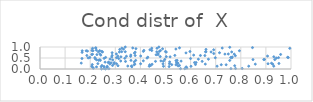
| Category | Series 0 |
|---|---|
| -100.0 | -100000 |
| -100.0 | -100000 |
| 0.19187879786047768 | 0.504 |
| -100.0 | -100000 |
| -100.0 | -100000 |
| -100.0 | -100000 |
| -100.0 | -100000 |
| -100.0 | -100000 |
| -100.0 | -100000 |
| -100.0 | -100000 |
| -100.0 | -100000 |
| -100.0 | -100000 |
| 0.4296224976861439 | 0.537 |
| -100.0 | -100000 |
| -100.0 | -100000 |
| -100.0 | -100000 |
| -100.0 | -100000 |
| -100.0 | -100000 |
| -100.0 | -100000 |
| -100.0 | -100000 |
| -100.0 | -100000 |
| -100.0 | -100000 |
| -100.0 | -100000 |
| -100.0 | -100000 |
| 0.2251686918316177 | 0.418 |
| -100.0 | -100000 |
| -100.0 | -100000 |
| -100.0 | -100000 |
| -100.0 | -100000 |
| -100.0 | -100000 |
| -100.0 | -100000 |
| -100.0 | -100000 |
| -100.0 | -100000 |
| -100.0 | -100000 |
| -100.0 | -100000 |
| -100.0 | -100000 |
| -100.0 | -100000 |
| -100.0 | -100000 |
| 0.20939885757398724 | 0.94 |
| -100.0 | -100000 |
| 0.5816440431107636 | 0.731 |
| -100.0 | -100000 |
| -100.0 | -100000 |
| -100.0 | -100000 |
| -100.0 | -100000 |
| -100.0 | -100000 |
| -100.0 | -100000 |
| -100.0 | -100000 |
| -100.0 | -100000 |
| -100.0 | -100000 |
| -100.0 | -100000 |
| -100.0 | -100000 |
| -100.0 | -100000 |
| -100.0 | -100000 |
| -100.0 | -100000 |
| -100.0 | -100000 |
| -100.0 | -100000 |
| -100.0 | -100000 |
| 0.7637295574614567 | 0.775 |
| 0.3050601643916153 | 0.512 |
| -100.0 | -100000 |
| 0.2553474817145608 | 0.482 |
| -100.0 | -100000 |
| -100.0 | -100000 |
| 0.49203139905379956 | 0.122 |
| 0.2667020137794205 | 0.087 |
| 0.9065603821030419 | 0.587 |
| 0.18915653105718144 | 0.813 |
| -100.0 | -100000 |
| -100.0 | -100000 |
| -100.0 | -100000 |
| -100.0 | -100000 |
| -100.0 | -100000 |
| -100.0 | -100000 |
| -100.0 | -100000 |
| -100.0 | -100000 |
| -100.0 | -100000 |
| -100.0 | -100000 |
| -100.0 | -100000 |
| 0.7639932975936461 | 0.51 |
| -100.0 | -100000 |
| -100.0 | -100000 |
| -100.0 | -100000 |
| -100.0 | -100000 |
| -100.0 | -100000 |
| -100.0 | -100000 |
| -100.0 | -100000 |
| -100.0 | -100000 |
| -100.0 | -100000 |
| -100.0 | -100000 |
| -100.0 | -100000 |
| -100.0 | -100000 |
| -100.0 | -100000 |
| -100.0 | -100000 |
| -100.0 | -100000 |
| 0.3822589108104296 | 0.925 |
| -100.0 | -100000 |
| -100.0 | -100000 |
| -100.0 | -100000 |
| -100.0 | -100000 |
| -100.0 | -100000 |
| -100.0 | -100000 |
| -100.0 | -100000 |
| -100.0 | -100000 |
| -100.0 | -100000 |
| -100.0 | -100000 |
| -100.0 | -100000 |
| -100.0 | -100000 |
| -100.0 | -100000 |
| -100.0 | -100000 |
| 0.5496870743826148 | 0.266 |
| -100.0 | -100000 |
| -100.0 | -100000 |
| -100.0 | -100000 |
| -100.0 | -100000 |
| -100.0 | -100000 |
| 0.9418769743370389 | 0.497 |
| 0.3256701429219151 | 0.788 |
| 0.7740199675463291 | 0.675 |
| -100.0 | -100000 |
| 0.16433612483010096 | 0.268 |
| -100.0 | -100000 |
| 0.681617395554677 | 0.774 |
| -100.0 | -100000 |
| -100.0 | -100000 |
| -100.0 | -100000 |
| -100.0 | -100000 |
| 0.5502491938861755 | 0.14 |
| -100.0 | -100000 |
| -100.0 | -100000 |
| -100.0 | -100000 |
| 0.3327204524582331 | 0.906 |
| -100.0 | -100000 |
| -100.0 | -100000 |
| -100.0 | -100000 |
| -100.0 | -100000 |
| -100.0 | -100000 |
| -100.0 | -100000 |
| -100.0 | -100000 |
| -100.0 | -100000 |
| -100.0 | -100000 |
| -100.0 | -100000 |
| -100.0 | -100000 |
| -100.0 | -100000 |
| -100.0 | -100000 |
| -100.0 | -100000 |
| -100.0 | -100000 |
| -100.0 | -100000 |
| 0.282922323134851 | 0.283 |
| -100.0 | -100000 |
| 0.6611241601250445 | 0.781 |
| -100.0 | -100000 |
| -100.0 | -100000 |
| 0.25502019649960594 | 0.024 |
| -100.0 | -100000 |
| 0.34988766715490793 | 0.134 |
| -100.0 | -100000 |
| -100.0 | -100000 |
| -100.0 | -100000 |
| 0.4466318419540014 | 0.216 |
| -100.0 | -100000 |
| -100.0 | -100000 |
| -100.0 | -100000 |
| -100.0 | -100000 |
| 0.4704986228340291 | 0.699 |
| -100.0 | -100000 |
| -100.0 | -100000 |
| -100.0 | -100000 |
| -100.0 | -100000 |
| -100.0 | -100000 |
| -100.0 | -100000 |
| -100.0 | -100000 |
| -100.0 | -100000 |
| -100.0 | -100000 |
| -100.0 | -100000 |
| 0.6155970152128075 | 0.292 |
| -100.0 | -100000 |
| -100.0 | -100000 |
| -100.0 | -100000 |
| -100.0 | -100000 |
| -100.0 | -100000 |
| 0.21974380534102522 | 0.465 |
| -100.0 | -100000 |
| -100.0 | -100000 |
| -100.0 | -100000 |
| -100.0 | -100000 |
| -100.0 | -100000 |
| -100.0 | -100000 |
| -100.0 | -100000 |
| -100.0 | -100000 |
| -100.0 | -100000 |
| -100.0 | -100000 |
| -100.0 | -100000 |
| -100.0 | -100000 |
| -100.0 | -100000 |
| 0.37521510980602013 | 0.196 |
| -100.0 | -100000 |
| -100.0 | -100000 |
| -100.0 | -100000 |
| 0.3624422175529668 | 0.391 |
| -100.0 | -100000 |
| -100.0 | -100000 |
| -100.0 | -100000 |
| 0.44523287967693836 | 0.842 |
| 0.4789717255678654 | 0.566 |
| -100.0 | -100000 |
| -100.0 | -100000 |
| -100.0 | -100000 |
| -100.0 | -100000 |
| -100.0 | -100000 |
| -100.0 | -100000 |
| -100.0 | -100000 |
| -100.0 | -100000 |
| 0.4351982912702477 | 0.125 |
| 0.7599091323669214 | 0.526 |
| -100.0 | -100000 |
| 0.278606509897224 | 0.226 |
| -100.0 | -100000 |
| -100.0 | -100000 |
| -100.0 | -100000 |
| 0.5852058785735164 | 0.042 |
| 0.2613730196282348 | 0.527 |
| -100.0 | -100000 |
| -100.0 | -100000 |
| -100.0 | -100000 |
| -100.0 | -100000 |
| 0.8315266321342155 | 0.129 |
| -100.0 | -100000 |
| -100.0 | -100000 |
| -100.0 | -100000 |
| 0.6596618350748987 | 0.783 |
| -100.0 | -100000 |
| -100.0 | -100000 |
| -100.0 | -100000 |
| -100.0 | -100000 |
| -100.0 | -100000 |
| -100.0 | -100000 |
| -100.0 | -100000 |
| 0.7503182706500822 | 0.682 |
| -100.0 | -100000 |
| -100.0 | -100000 |
| -100.0 | -100000 |
| -100.0 | -100000 |
| -100.0 | -100000 |
| -100.0 | -100000 |
| -100.0 | -100000 |
| -100.0 | -100000 |
| -100.0 | -100000 |
| -100.0 | -100000 |
| -100.0 | -100000 |
| -100.0 | -100000 |
| -100.0 | -100000 |
| -100.0 | -100000 |
| -100.0 | -100000 |
| -100.0 | -100000 |
| -100.0 | -100000 |
| -100.0 | -100000 |
| -100.0 | -100000 |
| -100.0 | -100000 |
| -100.0 | -100000 |
| -100.0 | -100000 |
| -100.0 | -100000 |
| -100.0 | -100000 |
| -100.0 | -100000 |
| -100.0 | -100000 |
| -100.0 | -100000 |
| -100.0 | -100000 |
| -100.0 | -100000 |
| -100.0 | -100000 |
| -100.0 | -100000 |
| -100.0 | -100000 |
| -100.0 | -100000 |
| -100.0 | -100000 |
| 0.33795944759262986 | 0.487 |
| -100.0 | -100000 |
| -100.0 | -100000 |
| -100.0 | -100000 |
| -100.0 | -100000 |
| -100.0 | -100000 |
| -100.0 | -100000 |
| -100.0 | -100000 |
| 0.23914817014861622 | 0.683 |
| -100.0 | -100000 |
| -100.0 | -100000 |
| -100.0 | -100000 |
| -100.0 | -100000 |
| -100.0 | -100000 |
| 0.24680507783390082 | 0.158 |
| -100.0 | -100000 |
| 0.23783188197156513 | 0.833 |
| -100.0 | -100000 |
| -100.0 | -100000 |
| -100.0 | -100000 |
| -100.0 | -100000 |
| -100.0 | -100000 |
| -100.0 | -100000 |
| 0.34424693027069375 | 0.58 |
| -100.0 | -100000 |
| -100.0 | -100000 |
| -100.0 | -100000 |
| -100.0 | -100000 |
| -100.0 | -100000 |
| -100.0 | -100000 |
| -100.0 | -100000 |
| -100.0 | -100000 |
| -100.0 | -100000 |
| -100.0 | -100000 |
| 0.6391309777898468 | 0.615 |
| -100.0 | -100000 |
| 0.16731013530644934 | 0.477 |
| -100.0 | -100000 |
| -100.0 | -100000 |
| -100.0 | -100000 |
| 0.20828665464862384 | 0.201 |
| -100.0 | -100000 |
| -100.0 | -100000 |
| -100.0 | -100000 |
| 0.38118780702664146 | 0.391 |
| -100.0 | -100000 |
| -100.0 | -100000 |
| -100.0 | -100000 |
| -100.0 | -100000 |
| -100.0 | -100000 |
| 0.5032850026031422 | 0.56 |
| 0.6016906126865291 | 0.123 |
| -100.0 | -100000 |
| -100.0 | -100000 |
| 0.23047496795832656 | 0.244 |
| -100.0 | -100000 |
| -100.0 | -100000 |
| -100.0 | -100000 |
| -100.0 | -100000 |
| -100.0 | -100000 |
| -100.0 | -100000 |
| -100.0 | -100000 |
| -100.0 | -100000 |
| 0.37913019498877587 | 0.765 |
| -100.0 | -100000 |
| -100.0 | -100000 |
| -100.0 | -100000 |
| -100.0 | -100000 |
| -100.0 | -100000 |
| -100.0 | -100000 |
| -100.0 | -100000 |
| -100.0 | -100000 |
| -100.0 | -100000 |
| -100.0 | -100000 |
| -100.0 | -100000 |
| -100.0 | -100000 |
| 0.9587002853319889 | 0.661 |
| -100.0 | -100000 |
| 0.30500730674287335 | 0.239 |
| 0.3163226875464985 | 0.772 |
| -100.0 | -100000 |
| -100.0 | -100000 |
| -100.0 | -100000 |
| -100.0 | -100000 |
| -100.0 | -100000 |
| -100.0 | -100000 |
| -100.0 | -100000 |
| -100.0 | -100000 |
| 0.7559870351411391 | 0.389 |
| -100.0 | -100000 |
| -100.0 | -100000 |
| -100.0 | -100000 |
| -100.0 | -100000 |
| -100.0 | -100000 |
| -100.0 | -100000 |
| 0.16779261318989291 | 0.754 |
| -100.0 | -100000 |
| -100.0 | -100000 |
| -100.0 | -100000 |
| -100.0 | -100000 |
| -100.0 | -100000 |
| 0.376183444377469 | 0.72 |
| -100.0 | -100000 |
| -100.0 | -100000 |
| -100.0 | -100000 |
| -100.0 | -100000 |
| -100.0 | -100000 |
| -100.0 | -100000 |
| -100.0 | -100000 |
| -100.0 | -100000 |
| -100.0 | -100000 |
| -100.0 | -100000 |
| 0.6920109922518849 | 0.874 |
| 0.30435218441106715 | 0.684 |
| -100.0 | -100000 |
| -100.0 | -100000 |
| -100.0 | -100000 |
| 0.7943881429237363 | 0.83 |
| -100.0 | -100000 |
| -100.0 | -100000 |
| -100.0 | -100000 |
| -100.0 | -100000 |
| -100.0 | -100000 |
| -100.0 | -100000 |
| -100.0 | -100000 |
| -100.0 | -100000 |
| -100.0 | -100000 |
| -100.0 | -100000 |
| -100.0 | -100000 |
| -100.0 | -100000 |
| -100.0 | -100000 |
| -100.0 | -100000 |
| -100.0 | -100000 |
| 0.20650176269031983 | 0.657 |
| -100.0 | -100000 |
| -100.0 | -100000 |
| -100.0 | -100000 |
| 0.894416459786068 | 0.434 |
| -100.0 | -100000 |
| -100.0 | -100000 |
| 0.5158422454907788 | 0.239 |
| -100.0 | -100000 |
| -100.0 | -100000 |
| -100.0 | -100000 |
| -100.0 | -100000 |
| 0.4263880408014544 | 0.496 |
| -100.0 | -100000 |
| -100.0 | -100000 |
| -100.0 | -100000 |
| -100.0 | -100000 |
| 0.22471361010595137 | 0.853 |
| 0.3175891911530946 | 0.889 |
| -100.0 | -100000 |
| -100.0 | -100000 |
| -100.0 | -100000 |
| -100.0 | -100000 |
| -100.0 | -100000 |
| -100.0 | -100000 |
| -100.0 | -100000 |
| -100.0 | -100000 |
| -100.0 | -100000 |
| -100.0 | -100000 |
| -100.0 | -100000 |
| -100.0 | -100000 |
| -100.0 | -100000 |
| -100.0 | -100000 |
| -100.0 | -100000 |
| -100.0 | -100000 |
| -100.0 | -100000 |
| -100.0 | -100000 |
| 0.4370916397126354 | 0.192 |
| 0.9224302886151942 | 0.262 |
| -100.0 | -100000 |
| -100.0 | -100000 |
| -100.0 | -100000 |
| -100.0 | -100000 |
| -100.0 | -100000 |
| -100.0 | -100000 |
| -100.0 | -100000 |
| -100.0 | -100000 |
| -100.0 | -100000 |
| -100.0 | -100000 |
| -100.0 | -100000 |
| -100.0 | -100000 |
| -100.0 | -100000 |
| 0.37546543730731485 | 0.326 |
| -100.0 | -100000 |
| 0.2187454687769319 | 0.519 |
| -100.0 | -100000 |
| -100.0 | -100000 |
| -100.0 | -100000 |
| -100.0 | -100000 |
| 0.27189752846479587 | 0.291 |
| -100.0 | -100000 |
| -100.0 | -100000 |
| -100.0 | -100000 |
| -100.0 | -100000 |
| -100.0 | -100000 |
| -100.0 | -100000 |
| -100.0 | -100000 |
| -100.0 | -100000 |
| -100.0 | -100000 |
| 0.43771643095411816 | 0.872 |
| -100.0 | -100000 |
| -100.0 | -100000 |
| 0.2228108382298407 | 0.954 |
| 0.7790921357145734 | 0.021 |
| -100.0 | -100000 |
| -100.0 | -100000 |
| -100.0 | -100000 |
| -100.0 | -100000 |
| -100.0 | -100000 |
| -100.0 | -100000 |
| -100.0 | -100000 |
| -100.0 | -100000 |
| -100.0 | -100000 |
| 0.6568691607360193 | 0.611 |
| -100.0 | -100000 |
| -100.0 | -100000 |
| -100.0 | -100000 |
| -100.0 | -100000 |
| -100.0 | -100000 |
| -100.0 | -100000 |
| -100.0 | -100000 |
| -100.0 | -100000 |
| -100.0 | -100000 |
| -100.0 | -100000 |
| -100.0 | -100000 |
| -100.0 | -100000 |
| -100.0 | -100000 |
| -100.0 | -100000 |
| -100.0 | -100000 |
| -100.0 | -100000 |
| 0.23341933274696025 | 0.395 |
| -100.0 | -100000 |
| -100.0 | -100000 |
| -100.0 | -100000 |
| -100.0 | -100000 |
| -100.0 | -100000 |
| -100.0 | -100000 |
| -100.0 | -100000 |
| 0.22512395210268232 | 0.095 |
| -100.0 | -100000 |
| -100.0 | -100000 |
| -100.0 | -100000 |
| -100.0 | -100000 |
| -100.0 | -100000 |
| 0.31070677299256033 | 0.149 |
| -100.0 | -100000 |
| -100.0 | -100000 |
| -100.0 | -100000 |
| -100.0 | -100000 |
| -100.0 | -100000 |
| -100.0 | -100000 |
| -100.0 | -100000 |
| -100.0 | -100000 |
| -100.0 | -100000 |
| -100.0 | -100000 |
| -100.0 | -100000 |
| -100.0 | -100000 |
| -100.0 | -100000 |
| 0.8055011477738415 | 0.023 |
| -100.0 | -100000 |
| -100.0 | -100000 |
| -100.0 | -100000 |
| -100.0 | -100000 |
| -100.0 | -100000 |
| -100.0 | -100000 |
| 0.582386269931465 | 0.096 |
| -100.0 | -100000 |
| -100.0 | -100000 |
| -100.0 | -100000 |
| -100.0 | -100000 |
| -100.0 | -100000 |
| -100.0 | -100000 |
| 0.9353104379878 | 0.426 |
| -100.0 | -100000 |
| -100.0 | -100000 |
| -100.0 | -100000 |
| -100.0 | -100000 |
| -100.0 | -100000 |
| 0.555597384610156 | 0.162 |
| -100.0 | -100000 |
| -100.0 | -100000 |
| -100.0 | -100000 |
| -100.0 | -100000 |
| 0.20932897513727833 | 0.669 |
| -100.0 | -100000 |
| 0.2451965008652771 | 0.003 |
| -100.0 | -100000 |
| -100.0 | -100000 |
| -100.0 | -100000 |
| -100.0 | -100000 |
| -100.0 | -100000 |
| 0.3618406845669442 | 0.634 |
| -100.0 | -100000 |
| 0.27352491304284776 | 0.312 |
| -100.0 | -100000 |
| -100.0 | -100000 |
| 0.698445414171746 | 0.511 |
| 0.8915782337760583 | 0.428 |
| 0.3215353931150503 | 0.363 |
| -100.0 | -100000 |
| 0.5165515494945132 | 0.324 |
| -100.0 | -100000 |
| -100.0 | -100000 |
| -100.0 | -100000 |
| -100.0 | -100000 |
| -100.0 | -100000 |
| 0.736762711610288 | 0.677 |
| -100.0 | -100000 |
| -100.0 | -100000 |
| 0.5462561134884889 | 0.393 |
| 0.37790903698737244 | 0.222 |
| -100.0 | -100000 |
| 0.23821711912621968 | 0.421 |
| 0.3102538954576177 | 0.587 |
| -100.0 | -100000 |
| -100.0 | -100000 |
| -100.0 | -100000 |
| -100.0 | -100000 |
| -100.0 | -100000 |
| 0.9502939386492661 | 0.517 |
| -100.0 | -100000 |
| -100.0 | -100000 |
| -100.0 | -100000 |
| -100.0 | -100000 |
| -100.0 | -100000 |
| -100.0 | -100000 |
| -100.0 | -100000 |
| -100.0 | -100000 |
| -100.0 | -100000 |
| 0.2873610719695805 | 0.74 |
| -100.0 | -100000 |
| 0.6710027540885751 | 0.446 |
| -100.0 | -100000 |
| -100.0 | -100000 |
| -100.0 | -100000 |
| -100.0 | -100000 |
| -100.0 | -100000 |
| -100.0 | -100000 |
| -100.0 | -100000 |
| 0.1866818977305128 | 0.614 |
| -100.0 | -100000 |
| -100.0 | -100000 |
| -100.0 | -100000 |
| 0.4662170571116231 | 0.942 |
| -100.0 | -100000 |
| -100.0 | -100000 |
| -100.0 | -100000 |
| -100.0 | -100000 |
| -100.0 | -100000 |
| -100.0 | -100000 |
| -100.0 | -100000 |
| -100.0 | -100000 |
| -100.0 | -100000 |
| 0.3610351131361368 | 0.575 |
| 0.541670181146668 | 0.38 |
| -100.0 | -100000 |
| -100.0 | -100000 |
| -100.0 | -100000 |
| -100.0 | -100000 |
| 0.7606733434378987 | 0.015 |
| -100.0 | -100000 |
| -100.0 | -100000 |
| -100.0 | -100000 |
| -100.0 | -100000 |
| -100.0 | -100000 |
| -100.0 | -100000 |
| -100.0 | -100000 |
| -100.0 | -100000 |
| -100.0 | -100000 |
| -100.0 | -100000 |
| -100.0 | -100000 |
| -100.0 | -100000 |
| 0.5599872243091598 | 0.015 |
| -100.0 | -100000 |
| -100.0 | -100000 |
| -100.0 | -100000 |
| -100.0 | -100000 |
| -100.0 | -100000 |
| 0.49159442339425374 | 0.35 |
| -100.0 | -100000 |
| 0.9314279714402884 | 0.128 |
| -100.0 | -100000 |
| -100.0 | -100000 |
| -100.0 | -100000 |
| -100.0 | -100000 |
| -100.0 | -100000 |
| -100.0 | -100000 |
| -100.0 | -100000 |
| -100.0 | -100000 |
| -100.0 | -100000 |
| -100.0 | -100000 |
| -100.0 | -100000 |
| -100.0 | -100000 |
| 0.9951383937138106 | 0.939 |
| -100.0 | -100000 |
| 0.21023838530924832 | 0.067 |
| -100.0 | -100000 |
| -100.0 | -100000 |
| 0.24899661968324804 | 0.774 |
| -100.0 | -100000 |
| -100.0 | -100000 |
| -100.0 | -100000 |
| -100.0 | -100000 |
| 0.9315422521077081 | 0.556 |
| -100.0 | -100000 |
| -100.0 | -100000 |
| -100.0 | -100000 |
| -100.0 | -100000 |
| 0.5452791084124988 | 0.294 |
| -100.0 | -100000 |
| -100.0 | -100000 |
| 0.23275767309322692 | 0.78 |
| -100.0 | -100000 |
| -100.0 | -100000 |
| 0.988968515245191 | 0.521 |
| -100.0 | -100000 |
| -100.0 | -100000 |
| 0.597468689486578 | 0.796 |
| -100.0 | -100000 |
| -100.0 | -100000 |
| -100.0 | -100000 |
| -100.0 | -100000 |
| -100.0 | -100000 |
| -100.0 | -100000 |
| -100.0 | -100000 |
| 0.2746716950019883 | 0.011 |
| -100.0 | -100000 |
| 0.20612441613082955 | 0.129 |
| -100.0 | -100000 |
| -100.0 | -100000 |
| 0.5999396826141097 | 0.475 |
| -100.0 | -100000 |
| -100.0 | -100000 |
| -100.0 | -100000 |
| -100.0 | -100000 |
| -100.0 | -100000 |
| 0.21258200194332366 | 0.033 |
| -100.0 | -100000 |
| -100.0 | -100000 |
| -100.0 | -100000 |
| -100.0 | -100000 |
| -100.0 | -100000 |
| -100.0 | -100000 |
| -100.0 | -100000 |
| -100.0 | -100000 |
| -100.0 | -100000 |
| -100.0 | -100000 |
| 0.44105098137775434 | 0.16 |
| -100.0 | -100000 |
| -100.0 | -100000 |
| 0.21110580276425195 | 0.83 |
| -100.0 | -100000 |
| -100.0 | -100000 |
| 0.4116622878513345 | 0.371 |
| -100.0 | -100000 |
| 0.3407192627931094 | 0.345 |
| -100.0 | -100000 |
| -100.0 | -100000 |
| 0.41385437623360777 | 0.844 |
| -100.0 | -100000 |
| 0.4817336766026966 | 0.368 |
| -100.0 | -100000 |
| 0.5248868619039916 | 0.197 |
| 0.6586281720351973 | 0.222 |
| -100.0 | -100000 |
| 0.3223727914639689 | 0.554 |
| -100.0 | -100000 |
| 0.2593472433746231 | 0.312 |
| -100.0 | -100000 |
| -100.0 | -100000 |
| -100.0 | -100000 |
| -100.0 | -100000 |
| -100.0 | -100000 |
| -100.0 | -100000 |
| -100.0 | -100000 |
| -100.0 | -100000 |
| 0.37920057562293696 | 0.613 |
| -100.0 | -100000 |
| -100.0 | -100000 |
| -100.0 | -100000 |
| -100.0 | -100000 |
| -100.0 | -100000 |
| -100.0 | -100000 |
| 0.4996907973285465 | 0.793 |
| -100.0 | -100000 |
| -100.0 | -100000 |
| 0.4653388486033244 | 0.78 |
| -100.0 | -100000 |
| -100.0 | -100000 |
| -100.0 | -100000 |
| -100.0 | -100000 |
| -100.0 | -100000 |
| -100.0 | -100000 |
| 0.5621662886144818 | 0.358 |
| -100.0 | -100000 |
| 0.6613810115313914 | 0.891 |
| -100.0 | -100000 |
| -100.0 | -100000 |
| 0.3694266199553855 | 0.957 |
| 0.4884188600730133 | 0.918 |
| -100.0 | -100000 |
| 0.6193978670536209 | 0.203 |
| -100.0 | -100000 |
| -100.0 | -100000 |
| 0.5557759700371547 | 0.962 |
| 0.1983826988384887 | 0.524 |
| -100.0 | -100000 |
| -100.0 | -100000 |
| -100.0 | -100000 |
| -100.0 | -100000 |
| -100.0 | -100000 |
| -100.0 | -100000 |
| -100.0 | -100000 |
| -100.0 | -100000 |
| -100.0 | -100000 |
| -100.0 | -100000 |
| -100.0 | -100000 |
| 0.7222283674976765 | 0.194 |
| -100.0 | -100000 |
| 0.47975809419131754 | 0.836 |
| -100.0 | -100000 |
| -100.0 | -100000 |
| -100.0 | -100000 |
| -100.0 | -100000 |
| -100.0 | -100000 |
| -100.0 | -100000 |
| -100.0 | -100000 |
| -100.0 | -100000 |
| -100.0 | -100000 |
| -100.0 | -100000 |
| -100.0 | -100000 |
| 0.2891202515745286 | 0.16 |
| -100.0 | -100000 |
| -100.0 | -100000 |
| -100.0 | -100000 |
| -100.0 | -100000 |
| -100.0 | -100000 |
| -100.0 | -100000 |
| -100.0 | -100000 |
| -100.0 | -100000 |
| -100.0 | -100000 |
| -100.0 | -100000 |
| -100.0 | -100000 |
| -100.0 | -100000 |
| -100.0 | -100000 |
| -100.0 | -100000 |
| -100.0 | -100000 |
| -100.0 | -100000 |
| 0.8485638244472773 | 0.428 |
| -100.0 | -100000 |
| -100.0 | -100000 |
| -100.0 | -100000 |
| -100.0 | -100000 |
| -100.0 | -100000 |
| -100.0 | -100000 |
| -100.0 | -100000 |
| -100.0 | -100000 |
| -100.0 | -100000 |
| -100.0 | -100000 |
| -100.0 | -100000 |
| -100.0 | -100000 |
| 0.3658313003531096 | 0.102 |
| -100.0 | -100000 |
| -100.0 | -100000 |
| -100.0 | -100000 |
| -100.0 | -100000 |
| -100.0 | -100000 |
| -100.0 | -100000 |
| -100.0 | -100000 |
| -100.0 | -100000 |
| -100.0 | -100000 |
| -100.0 | -100000 |
| -100.0 | -100000 |
| 0.2790518279686339 | 0.449 |
| -100.0 | -100000 |
| 0.7152152422028835 | 0.739 |
| -100.0 | -100000 |
| -100.0 | -100000 |
| -100.0 | -100000 |
| -100.0 | -100000 |
| -100.0 | -100000 |
| -100.0 | -100000 |
| -100.0 | -100000 |
| -100.0 | -100000 |
| -100.0 | -100000 |
| 0.3397003891745447 | 0.999 |
| -100.0 | -100000 |
| -100.0 | -100000 |
| -100.0 | -100000 |
| -100.0 | -100000 |
| -100.0 | -100000 |
| -100.0 | -100000 |
| 0.2895513735991486 | 0.413 |
| -100.0 | -100000 |
| 0.8465553823371011 | 0.972 |
| -100.0 | -100000 |
| -100.0 | -100000 |
| -100.0 | -100000 |
| -100.0 | -100000 |
| -100.0 | -100000 |
| -100.0 | -100000 |
| -100.0 | -100000 |
| -100.0 | -100000 |
| -100.0 | -100000 |
| 0.24045085899455299 | 0.391 |
| -100.0 | -100000 |
| -100.0 | -100000 |
| -100.0 | -100000 |
| -100.0 | -100000 |
| 0.5413917241796974 | 0.907 |
| -100.0 | -100000 |
| -100.0 | -100000 |
| -100.0 | -100000 |
| -100.0 | -100000 |
| -100.0 | -100000 |
| -100.0 | -100000 |
| -100.0 | -100000 |
| -100.0 | -100000 |
| -100.0 | -100000 |
| -100.0 | -100000 |
| -100.0 | -100000 |
| -100.0 | -100000 |
| 0.401118358799745 | 0.591 |
| -100.0 | -100000 |
| -100.0 | -100000 |
| -100.0 | -100000 |
| -100.0 | -100000 |
| -100.0 | -100000 |
| 0.28581587674909426 | 0.548 |
| -100.0 | -100000 |
| 0.3259898915490892 | 0.947 |
| -100.0 | -100000 |
| -100.0 | -100000 |
| -100.0 | -100000 |
| -100.0 | -100000 |
| -100.0 | -100000 |
| -100.0 | -100000 |
| -100.0 | -100000 |
| -100.0 | -100000 |
| -100.0 | -100000 |
| 0.24212587864365143 | 0.63 |
| -100.0 | -100000 |
| -100.0 | -100000 |
| -100.0 | -100000 |
| -100.0 | -100000 |
| -100.0 | -100000 |
| -100.0 | -100000 |
| -100.0 | -100000 |
| 0.5768191920200989 | 0.016 |
| -100.0 | -100000 |
| -100.0 | -100000 |
| -100.0 | -100000 |
| -100.0 | -100000 |
| 0.22178904538462862 | 0.958 |
| -100.0 | -100000 |
| -100.0 | -100000 |
| -100.0 | -100000 |
| -100.0 | -100000 |
| -100.0 | -100000 |
| -100.0 | -100000 |
| -100.0 | -100000 |
| -100.0 | -100000 |
| -100.0 | -100000 |
| -100.0 | -100000 |
| -100.0 | -100000 |
| -100.0 | -100000 |
| -100.0 | -100000 |
| -100.0 | -100000 |
| -100.0 | -100000 |
| -100.0 | -100000 |
| -100.0 | -100000 |
| -100.0 | -100000 |
| -100.0 | -100000 |
| 0.6219227901636352 | 0.295 |
| -100.0 | -100000 |
| -100.0 | -100000 |
| -100.0 | -100000 |
| -100.0 | -100000 |
| -100.0 | -100000 |
| -100.0 | -100000 |
| -100.0 | -100000 |
| -100.0 | -100000 |
| -100.0 | -100000 |
| -100.0 | -100000 |
| -100.0 | -100000 |
| -100.0 | -100000 |
| -100.0 | -100000 |
| -100.0 | -100000 |
| -100.0 | -100000 |
| -100.0 | -100000 |
| -100.0 | -100000 |
| -100.0 | -100000 |
| -100.0 | -100000 |
| -100.0 | -100000 |
| -100.0 | -100000 |
| -100.0 | -100000 |
| -100.0 | -100000 |
| 0.5372513183213166 | 0.618 |
| -100.0 | -100000 |
| -100.0 | -100000 |
| -100.0 | -100000 |
| -100.0 | -100000 |
| -100.0 | -100000 |
| -100.0 | -100000 |
| -100.0 | -100000 |
| -100.0 | -100000 |
| -100.0 | -100000 |
| -100.0 | -100000 |
| -100.0 | -100000 |
| -100.0 | -100000 |
| -100.0 | -100000 |
| -100.0 | -100000 |
| -100.0 | -100000 |
| -100.0 | -100000 |
| -100.0 | -100000 |
| -100.0 | -100000 |
| -100.0 | -100000 |
| -100.0 | -100000 |
| -100.0 | -100000 |
| -100.0 | -100000 |
| 0.544466317788866 | 0.282 |
| -100.0 | -100000 |
| -100.0 | -100000 |
| -100.0 | -100000 |
| -100.0 | -100000 |
| -100.0 | -100000 |
| -100.0 | -100000 |
| -100.0 | -100000 |
| -100.0 | -100000 |
| -100.0 | -100000 |
| -100.0 | -100000 |
| -100.0 | -100000 |
| 0.4760254089343101 | 0.803 |
| -100.0 | -100000 |
| -100.0 | -100000 |
| -100.0 | -100000 |
| -100.0 | -100000 |
| -100.0 | -100000 |
| -100.0 | -100000 |
| -100.0 | -100000 |
| -100.0 | -100000 |
| -100.0 | -100000 |
| -100.0 | -100000 |
| -100.0 | -100000 |
| 0.24620833823263166 | 0.8 |
| -100.0 | -100000 |
| 0.24396287554375828 | 0.107 |
| -100.0 | -100000 |
| 0.26682284188201755 | 0.034 |
| -100.0 | -100000 |
| -100.0 | -100000 |
| -100.0 | -100000 |
| -100.0 | -100000 |
| 0.26800713240922225 | 0.12 |
| -100.0 | -100000 |
| -100.0 | -100000 |
| -100.0 | -100000 |
| -100.0 | -100000 |
| -100.0 | -100000 |
| -100.0 | -100000 |
| 0.47007889627485333 | 0.653 |
| -100.0 | -100000 |
| 0.16814942213434603 | 0.828 |
| -100.0 | -100000 |
| -100.0 | -100000 |
| -100.0 | -100000 |
| -100.0 | -100000 |
| -100.0 | -100000 |
| -100.0 | -100000 |
| -100.0 | -100000 |
| -100.0 | -100000 |
| -100.0 | -100000 |
| -100.0 | -100000 |
| -100.0 | -100000 |
| -100.0 | -100000 |
| -100.0 | -100000 |
| -100.0 | -100000 |
| -100.0 | -100000 |
| -100.0 | -100000 |
| -100.0 | -100000 |
| -100.0 | -100000 |
| -100.0 | -100000 |
| -100.0 | -100000 |
| -100.0 | -100000 |
| 0.36451257747274046 | 0.136 |
| -100.0 | -100000 |
| 0.7416212943139787 | 0.193 |
| -100.0 | -100000 |
| -100.0 | -100000 |
| -100.0 | -100000 |
| 0.9274636370874937 | 0.219 |
| -100.0 | -100000 |
| 0.29552333042247536 | 0.288 |
| 0.5144856794780535 | 0.112 |
| 0.4968469711366573 | 0.435 |
| -100.0 | -100000 |
| -100.0 | -100000 |
| -100.0 | -100000 |
| -100.0 | -100000 |
| -100.0 | -100000 |
| 0.7260121189864083 | 0.952 |
| -100.0 | -100000 |
| -100.0 | -100000 |
| -100.0 | -100000 |
| -100.0 | -100000 |
| -100.0 | -100000 |
| -100.0 | -100000 |
| -100.0 | -100000 |
| 0.4601863265841575 | 0.347 |
| 0.40088013520726296 | 0.238 |
| -100.0 | -100000 |
| -100.0 | -100000 |
| -100.0 | -100000 |
| -100.0 | -100000 |
| -100.0 | -100000 |
| 0.7560065297023854 | 0.986 |
| -100.0 | -100000 |
| 0.7056175805659578 | 0.128 |
| -100.0 | -100000 |
| -100.0 | -100000 |
| 0.8577922127039965 | 0.221 |
| 0.4450565565016976 | 0.943 |
| 0.6923559237371507 | 0.702 |
| -100.0 | -100000 |
| -100.0 | -100000 |
| 0.47368652360903285 | 1 |
| -100.0 | -100000 |
| -100.0 | -100000 |
| -100.0 | -100000 |
| -100.0 | -100000 |
| -100.0 | -100000 |
| -100.0 | -100000 |
| -100.0 | -100000 |
| -100.0 | -100000 |
| -100.0 | -100000 |
| -100.0 | -100000 |
| -100.0 | -100000 |
| -100.0 | -100000 |
| -100.0 | -100000 |
| 0.7660234392175441 | 0.546 |
| -100.0 | -100000 |
| 0.41182801773016753 | 0.801 |
| -100.0 | -100000 |
| -100.0 | -100000 |
| 0.20717434804876367 | 0.843 |
| -100.0 | -100000 |
| 0.2605128012499368 | 0.002 |
| -100.0 | -100000 |
| 0.775684601501334 | 0.148 |
| -100.0 | -100000 |
| -100.0 | -100000 |
| -100.0 | -100000 |
| -100.0 | -100000 |
| 0.4900500350771736 | 0.233 |
| 0.64610717437713 | 0.347 |
| -100.0 | -100000 |
| -100.0 | -100000 |
| 0.9518496557362567 | 0.251 |
| -100.0 | -100000 |
| -100.0 | -100000 |
| -100.0 | -100000 |
| 0.6309455862576209 | 0.445 |
| -100.0 | -100000 |
| -100.0 | -100000 |
| -100.0 | -100000 |
| -100.0 | -100000 |
| -100.0 | -100000 |
| -100.0 | -100000 |
| -100.0 | -100000 |
| -100.0 | -100000 |
| 0.9084951843181764 | 0.239 |
| 0.5184159441631183 | 0.553 |
| -100.0 | -100000 |
| -100.0 | -100000 |
| -100.0 | -100000 |
| -100.0 | -100000 |
| -100.0 | -100000 |
| -100.0 | -100000 |
| 0.7783734931368538 | 0.603 |
| 0.5418427939405085 | 0.188 |
| 0.9866158776606906 | 0.532 |
| 0.6122939101535667 | 0.632 |
| 0.3135548472391231 | 0.473 |
| -100.0 | -100000 |
| -100.0 | -100000 |
| 0.33955631194562874 | 0.785 |
| -100.0 | -100000 |
| 0.18411294512509713 | 0.829 |
| -100.0 | -100000 |
| -100.0 | -100000 |
| 0.46262761199990754 | 0.647 |
| -100.0 | -100000 |
| -100.0 | -100000 |
| -100.0 | -100000 |
| -100.0 | -100000 |
| -100.0 | -100000 |
| -100.0 | -100000 |
| 0.2549484953543869 | 0.113 |
| 0.28750037182133814 | 0.617 |
| -100.0 | -100000 |
| -100.0 | -100000 |
| -100.0 | -100000 |
| 0.5032417134034316 | 0.77 |
| -100.0 | -100000 |
| 0.29446091905118865 | 0.239 |
| -100.0 | -100000 |
| -100.0 | -100000 |
| 0.5464932255347902 | 0.245 |
| -100.0 | -100000 |
| -100.0 | -100000 |
| -100.0 | -100000 |
| -100.0 | -100000 |
| -100.0 | -100000 |
| -100.0 | -100000 |
| -100.0 | -100000 |
| -100.0 | -100000 |
| 0.2268155659145379 | 0.654 |
| -100.0 | -100000 |
| -100.0 | -100000 |
| -100.0 | -100000 |
| -100.0 | -100000 |
| -100.0 | -100000 |
| -100.0 | -100000 |
| -100.0 | -100000 |
| -100.0 | -100000 |
| -100.0 | -100000 |
| -100.0 | -100000 |
| -100.0 | -100000 |
| -100.0 | -100000 |
| -100.0 | -100000 |
| -100.0 | -100000 |
| -100.0 | -100000 |
| -100.0 | -100000 |
| -100.0 | -100000 |
| -100.0 | -100000 |
| -100.0 | -100000 |
| -100.0 | -100000 |